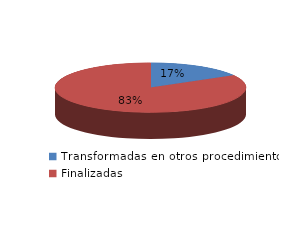
| Category | Series 0 |
|---|---|
| Transformadas en otros procedimientos | 1044 |
| Finalizadas | 5213 |